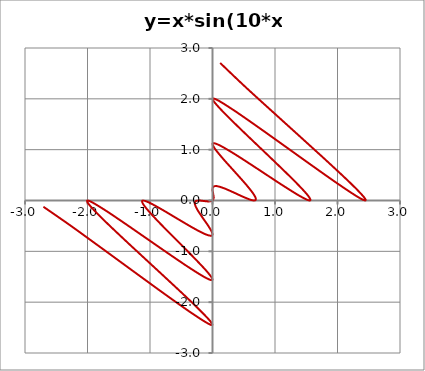
| Category | y=x*sin(10*x) |
|---|---|
| -2.7053131176562117 | -0.123 |
| -2.2138118522209873 | -0.544 |
| -1.5448633477206244 | -1.142 |
| -0.8601323648671854 | -1.756 |
| -0.3169414915374247 | -2.229 |
| -0.030161279431621946 | -2.445 |
| -0.04640336194671635 | -2.358 |
| -0.3362675890994513 | -1.997 |
| -0.8056454298345312 | -1.457 |
| -1.3223070735268756 | -0.87 |
| -1.7503945840271977 | -0.371 |
| -1.9838572512364454 | -0.067 |
| -1.970600743848331 | -0.009 |
| -1.721882069748008 | -0.187 |
| -1.30547266480504 | -0.533 |
| -0.8252626472854443 | -0.943 |
| -0.3932309187208654 | -1.304 |
| -0.10127890363882819 | -1.525 |
| -7.6175158498781315e-06 | -1.556 |
| -0.08932134112600265 | -1.396 |
| -0.3224257645680355 | -1.092 |
| -0.6212685685795234 | -0.722 |
| -0.8986667010779896 | -0.374 |
| -1.0809640682307815 | -0.121 |
| -1.125350965117419 | -0.006 |
| -1.027779694137592 | -0.033 |
| -0.8201665222025023 | -0.17 |
| -0.5584927292959373 | -0.361 |
| -0.30571811258488213 | -0.543 |
| -0.11451793791633746 | -0.663 |
| -0.014522461963925481 | -0.693 |
| -0.007149872777163224 | -0.629 |
| -0.0687866418941645 | -0.497 |
| -0.16067295375624935 | -0.334 |
| -0.24206810875403392 | -0.182 |
| -0.28257262315842696 | -0.071 |
| -0.2700154315620931 | -0.013 |
| -0.21186633756207884 | 0 |
| -0.13021166207159335 | -0.011 |
| -0.05230559153037963 | -0.018 |
| 0.0 | 0 |
| 0.01840508658827514 | 0.052 |
| 0.01120969416571617 | 0.13 |
| 0.0002656967938854532 | 0.212 |
| 0.01282728091252594 | 0.27 |
| 0.07098076743484681 | 0.283 |
| 0.1821959599578947 | 0.242 |
| 0.334301793074334 | 0.161 |
| 0.4968987830550736 | 0.069 |
| 0.6292462302907296 | 0.007 |
| 0.6925843192226221 | 0.015 |
| 0.6632995213888649 | 0.115 |
| 0.5428100248389751 | 0.306 |
| 0.36074608624657456 | 0.558 |
| 0.1697829714586644 | 0.82 |
| 0.03288047764222929 | 1.028 |
| 0.006019884781057305 | 1.125 |
| 0.12111745978634958 | 1.081 |
| 0.37412550505779607 | 0.899 |
| 0.7222343156749171 | 0.621 |
| 1.0917877978050596 | 0.322 |
| 1.3956028993657474 | 0.089 |
| 1.555627301094555 | 0 |
| 1.5250666930902315 | 0.101 |
| 1.3038253561268491 | 0.393 |
| 0.9425043056809246 | 0.825 |
| 0.5330049662799836 | 1.305 |
| 0.1873062394556706 | 1.722 |
| 0.009298243474002432 | 1.971 |
| 0.0667524142045427 | 1.984 |
| 0.370925759532445 | 1.75 |
| 0.869723948151422 | 1.322 |
| 1.4570962699624213 | 0.806 |
| 1.9971847888161558 | 0.336 |
| 2.357759694087546 | 0.046 |
| 2.4447124547212944 | 0.03 |
| 2.2286429207341465 | 0.317 |
| 1.7561627255230405 | 0.86 |
| 1.1421424207882567 | 1.545 |
| 0.5439045944065484 | 2.214 |
| 0.12311400708997855 | 2.705 |